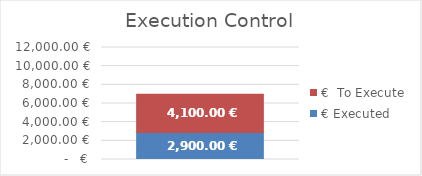
| Category | € Executed | €  To Execute |
|---|---|---|
| 0 | 2900 | 4100 |